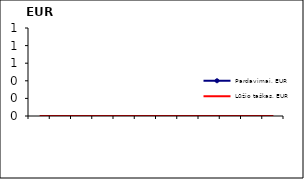
| Category | Pardavimai, EUR | Lūžio taškas, EUR |
|---|---|---|
| 0 |  | 0 |
| 1900-01-01 |  | 0 |
| 1900-01-02 |  | 0 |
| 1900-01-03 |  | 0 |
| 1900-01-04 |  | 0 |
| 1900-01-05 |  | 0 |
| 1900-01-06 |  | 0 |
| 1900-01-07 |  | 0 |
| 1900-01-08 |  | 0 |
| 1900-01-09 |  | 0 |
| 1900-01-10 |  | 0 |
| 1900-01-11 |  | 0 |